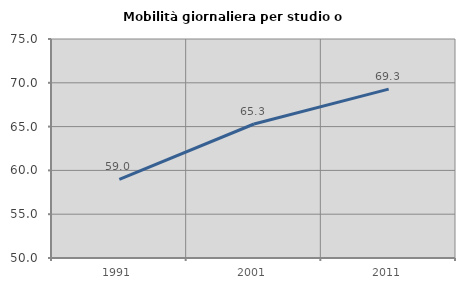
| Category | Mobilità giornaliera per studio o lavoro |
|---|---|
| 1991.0 | 58.985 |
| 2001.0 | 65.297 |
| 2011.0 | 69.28 |